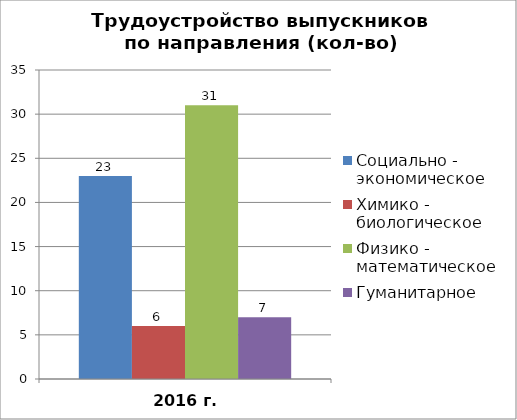
| Category | Социально - экономическое | Химико - биологическое | Физико - математическое | Гуманитарное |
|---|---|---|---|---|
| 2016 г. | 23 | 6 | 31 | 7 |